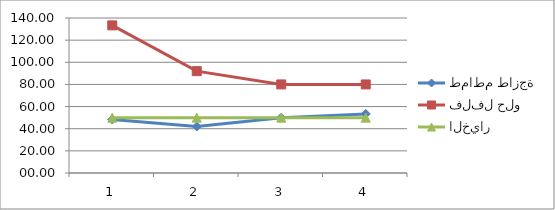
| Category | طماطم طازجة | فلفل حلو | الخيار |
|---|---|---|---|
| 0 | 48.33 | 133.33 | 50 |
| 1 | 42 | 92 | 50 |
| 2 | 50 | 80 | 50 |
| 3 | 53.33 | 80 | 50 |